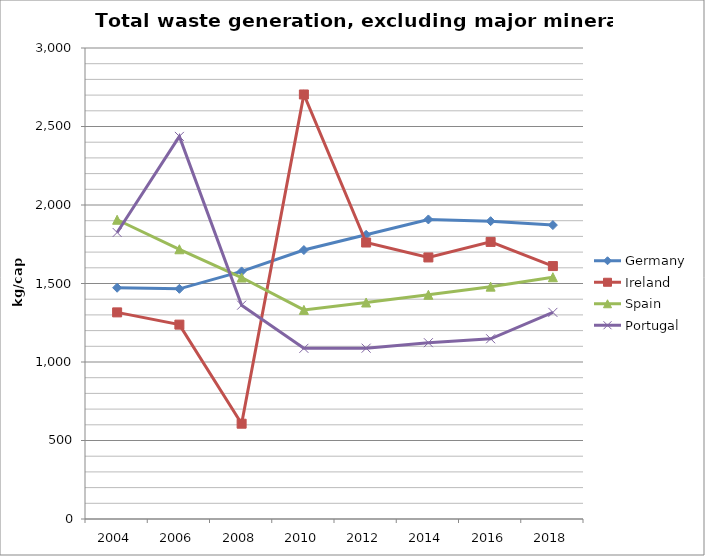
| Category | Germany | Ireland | Spain | Portugal |
|---|---|---|---|---|
| 2004 | 1473 | 1316 | 1906 | 1825 |
| 2006 | 1466 | 1238 | 1718 | 2437 |
| 2008 | 1577 | 607 | 1538 | 1362 |
| 2010 | 1713 | 2704 | 1332 | 1087 |
| 2012 | 1810 | 1761 | 1379 | 1088 |
| 2014 | 1908 | 1666 | 1428 | 1123 |
| 2016 | 1897 | 1765 | 1480 | 1148 |
| 2018 | 1872 | 1611 | 1540 | 1316 |